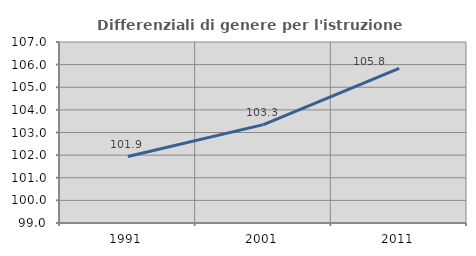
| Category | Differenziali di genere per l'istruzione superiore |
|---|---|
| 1991.0 | 101.938 |
| 2001.0 | 103.348 |
| 2011.0 | 105.835 |